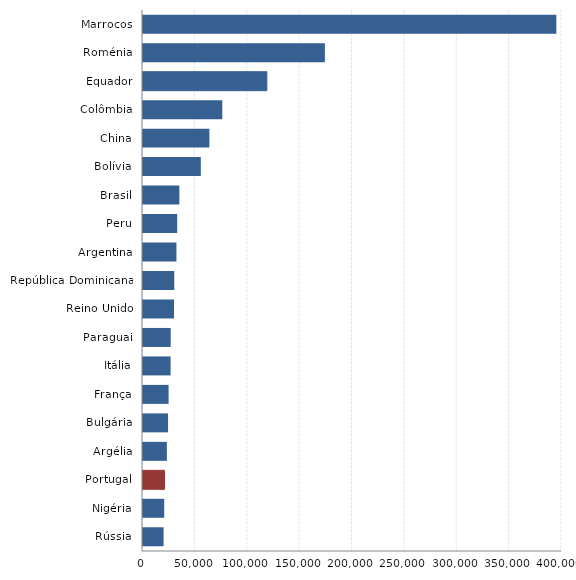
| Category | Series 0 |
|---|---|
| Marrocos | 394580 |
| Roménia | 173636 |
| Equador | 118253 |
| Colômbia | 75692 |
| China | 63383 |
| Bolívia | 55191 |
| Brasil | 34720 |
| Peru | 32632 |
| Argentina | 31939 |
| República Dominicana | 29834 |
| Reino Unido | 29582 |
| Paraguai | 26446 |
| Itália | 26339 |
| França | 24437 |
| Bulgária | 23903 |
| Argélia | 22795 |
| Portugal | 20545 |
| Nigéria | 20262 |
| Rússia | 19666 |